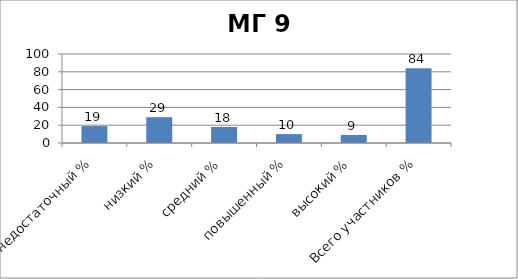
| Category | Series 0 |
|---|---|
| недостаточный % | 19 |
| низкий % | 29 |
| средний % | 18 |
| повышенный % | 10 |
| высокий % | 9 |
| Всего участников % | 84 |